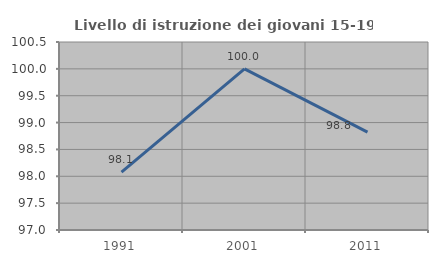
| Category | Livello di istruzione dei giovani 15-19 anni |
|---|---|
| 1991.0 | 98.077 |
| 2001.0 | 100 |
| 2011.0 | 98.824 |